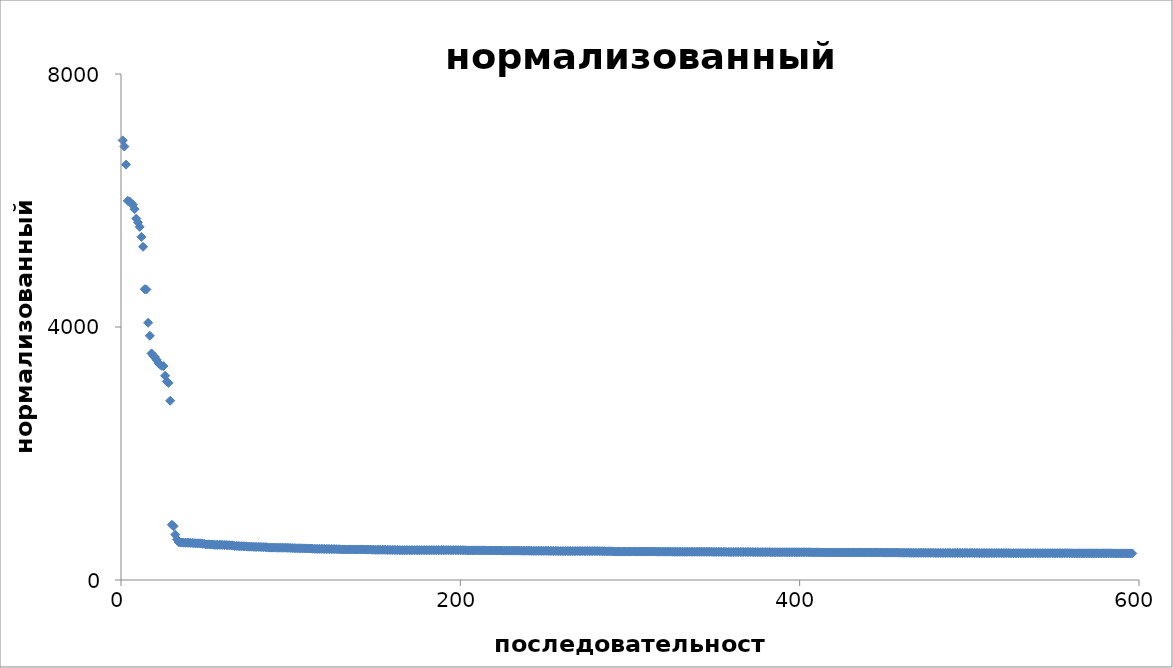
| Category | нормализованный вес |
|---|---|
| 1.0 | 6950.439 |
| 2.0 | 6853.223 |
| 3.0 | 6567.08 |
| 4.0 | 5994.792 |
| 5.0 | 5985.621 |
| 6.0 | 5954.438 |
| 7.0 | 5934.261 |
| 8.0 | 5862.726 |
| 9.0 | 5714.151 |
| 10.0 | 5653.62 |
| 11.0 | 5583.918 |
| 12.0 | 5424.338 |
| 13.0 | 5268.427 |
| 14.0 | 4597.089 |
| 15.0 | 4593.421 |
| 16.0 | 4066.99 |
| 17.0 | 3861.553 |
| 18.0 | 3582.746 |
| 19.0 | 3542.392 |
| 20.0 | 3525.884 |
| 21.0 | 3481.862 |
| 22.0 | 3430.503 |
| 23.0 | 3404.823 |
| 24.0 | 3386.481 |
| 25.0 | 3380.978 |
| 26.0 | 3228.735 |
| 27.0 | 3138.856 |
| 28.0 | 3116.845 |
| 29.0 | 2834.37 |
| 30.0 | 873.551 |
| 31.0 | 849.706 |
| 32.0 | 717.639 |
| 33.0 | 642.435 |
| 34.0 | 598.413 |
| 35.0 | 592.91 |
| 36.0 | 592.91 |
| 37.0 | 589.241 |
| 38.0 | 589.241 |
| 39.0 | 589.241 |
| 40.0 | 589.241 |
| 41.0 | 585.573 |
| 42.0 | 585.573 |
| 43.0 | 581.904 |
| 44.0 | 580.07 |
| 45.0 | 580.07 |
| 46.0 | 580.07 |
| 47.0 | 580.07 |
| 48.0 | 572.733 |
| 49.0 | 572.733 |
| 50.0 | 563.562 |
| 51.0 | 563.562 |
| 52.0 | 563.562 |
| 53.0 | 561.727 |
| 54.0 | 559.893 |
| 55.0 | 556.225 |
| 56.0 | 556.225 |
| 57.0 | 556.225 |
| 58.0 | 556.225 |
| 59.0 | 556.225 |
| 60.0 | 554.39 |
| 61.0 | 552.556 |
| 62.0 | 552.556 |
| 63.0 | 550.722 |
| 64.0 | 548.888 |
| 65.0 | 547.053 |
| 66.0 | 547.053 |
| 67.0 | 537.882 |
| 68.0 | 537.882 |
| 69.0 | 537.882 |
| 70.0 | 534.214 |
| 71.0 | 534.214 |
| 72.0 | 534.214 |
| 73.0 | 532.379 |
| 74.0 | 532.379 |
| 75.0 | 526.877 |
| 76.0 | 526.877 |
| 77.0 | 526.877 |
| 78.0 | 525.042 |
| 79.0 | 523.208 |
| 80.0 | 523.208 |
| 81.0 | 523.208 |
| 82.0 | 523.208 |
| 83.0 | 519.54 |
| 84.0 | 519.54 |
| 85.0 | 519.54 |
| 86.0 | 517.705 |
| 87.0 | 512.203 |
| 88.0 | 512.203 |
| 89.0 | 512.203 |
| 90.0 | 512.203 |
| 91.0 | 512.203 |
| 92.0 | 510.368 |
| 93.0 | 510.368 |
| 94.0 | 510.368 |
| 95.0 | 510.368 |
| 96.0 | 510.368 |
| 97.0 | 510.368 |
| 98.0 | 508.534 |
| 99.0 | 508.534 |
| 100.0 | 506.7 |
| 101.0 | 504.866 |
| 102.0 | 503.031 |
| 103.0 | 503.031 |
| 104.0 | 501.197 |
| 105.0 | 501.197 |
| 106.0 | 501.197 |
| 107.0 | 501.197 |
| 108.0 | 499.363 |
| 109.0 | 499.363 |
| 110.0 | 499.363 |
| 111.0 | 497.529 |
| 112.0 | 497.529 |
| 113.0 | 493.86 |
| 114.0 | 493.86 |
| 115.0 | 492.026 |
| 116.0 | 492.026 |
| 117.0 | 492.026 |
| 118.0 | 492.026 |
| 119.0 | 492.026 |
| 120.0 | 490.191 |
| 121.0 | 490.191 |
| 122.0 | 490.191 |
| 123.0 | 488.357 |
| 124.0 | 488.357 |
| 125.0 | 488.357 |
| 126.0 | 488.357 |
| 127.0 | 486.523 |
| 128.0 | 486.523 |
| 129.0 | 484.689 |
| 130.0 | 482.854 |
| 131.0 | 482.854 |
| 132.0 | 482.854 |
| 133.0 | 482.854 |
| 134.0 | 482.854 |
| 135.0 | 482.854 |
| 136.0 | 482.854 |
| 137.0 | 482.854 |
| 138.0 | 482.854 |
| 139.0 | 482.854 |
| 140.0 | 482.854 |
| 141.0 | 482.854 |
| 142.0 | 482.854 |
| 143.0 | 482.854 |
| 144.0 | 481.02 |
| 145.0 | 481.02 |
| 146.0 | 481.02 |
| 147.0 | 481.02 |
| 148.0 | 479.186 |
| 149.0 | 479.186 |
| 150.0 | 477.352 |
| 151.0 | 477.352 |
| 152.0 | 477.352 |
| 153.0 | 477.352 |
| 154.0 | 477.352 |
| 155.0 | 477.352 |
| 156.0 | 477.352 |
| 157.0 | 475.517 |
| 158.0 | 475.517 |
| 159.0 | 475.517 |
| 160.0 | 475.517 |
| 161.0 | 475.517 |
| 162.0 | 473.683 |
| 163.0 | 473.683 |
| 164.0 | 471.849 |
| 165.0 | 471.849 |
| 166.0 | 471.849 |
| 167.0 | 471.849 |
| 168.0 | 471.849 |
| 169.0 | 471.849 |
| 170.0 | 471.849 |
| 171.0 | 471.849 |
| 172.0 | 471.849 |
| 173.0 | 471.849 |
| 174.0 | 471.849 |
| 175.0 | 471.849 |
| 176.0 | 471.849 |
| 177.0 | 471.849 |
| 178.0 | 471.849 |
| 179.0 | 471.849 |
| 180.0 | 471.849 |
| 181.0 | 471.849 |
| 182.0 | 471.849 |
| 183.0 | 471.849 |
| 184.0 | 471.849 |
| 185.0 | 471.849 |
| 186.0 | 471.849 |
| 187.0 | 471.849 |
| 188.0 | 471.849 |
| 189.0 | 471.849 |
| 190.0 | 471.849 |
| 191.0 | 471.849 |
| 192.0 | 471.849 |
| 193.0 | 471.849 |
| 194.0 | 471.849 |
| 195.0 | 471.849 |
| 196.0 | 471.849 |
| 197.0 | 471.849 |
| 198.0 | 471.849 |
| 199.0 | 471.849 |
| 200.0 | 471.849 |
| 201.0 | 471.849 |
| 202.0 | 470.015 |
| 203.0 | 470.015 |
| 204.0 | 468.18 |
| 205.0 | 468.18 |
| 206.0 | 468.18 |
| 207.0 | 468.18 |
| 208.0 | 468.18 |
| 209.0 | 468.18 |
| 210.0 | 468.18 |
| 211.0 | 468.18 |
| 212.0 | 468.18 |
| 213.0 | 468.18 |
| 214.0 | 468.18 |
| 215.0 | 468.18 |
| 216.0 | 466.346 |
| 217.0 | 466.346 |
| 218.0 | 466.346 |
| 219.0 | 466.346 |
| 220.0 | 466.346 |
| 221.0 | 466.346 |
| 222.0 | 466.346 |
| 223.0 | 466.346 |
| 224.0 | 466.346 |
| 225.0 | 464.512 |
| 226.0 | 464.512 |
| 227.0 | 464.512 |
| 228.0 | 464.512 |
| 229.0 | 464.512 |
| 230.0 | 464.512 |
| 231.0 | 464.512 |
| 232.0 | 464.512 |
| 233.0 | 464.512 |
| 234.0 | 464.512 |
| 235.0 | 464.512 |
| 236.0 | 462.678 |
| 237.0 | 462.678 |
| 238.0 | 462.678 |
| 239.0 | 462.678 |
| 240.0 | 462.678 |
| 241.0 | 462.678 |
| 242.0 | 460.843 |
| 243.0 | 460.843 |
| 244.0 | 460.843 |
| 245.0 | 460.843 |
| 246.0 | 460.843 |
| 247.0 | 460.843 |
| 248.0 | 460.843 |
| 249.0 | 460.843 |
| 250.0 | 460.843 |
| 251.0 | 460.843 |
| 252.0 | 460.843 |
| 253.0 | 459.009 |
| 254.0 | 459.009 |
| 255.0 | 459.009 |
| 256.0 | 459.009 |
| 257.0 | 459.009 |
| 258.0 | 457.175 |
| 259.0 | 457.175 |
| 260.0 | 457.175 |
| 261.0 | 457.175 |
| 262.0 | 457.175 |
| 263.0 | 457.175 |
| 264.0 | 457.175 |
| 265.0 | 457.175 |
| 266.0 | 457.175 |
| 267.0 | 457.175 |
| 268.0 | 457.175 |
| 269.0 | 457.175 |
| 270.0 | 457.175 |
| 271.0 | 457.175 |
| 272.0 | 457.175 |
| 273.0 | 457.175 |
| 274.0 | 457.175 |
| 275.0 | 457.175 |
| 276.0 | 457.175 |
| 277.0 | 457.175 |
| 278.0 | 457.175 |
| 279.0 | 457.175 |
| 280.0 | 457.175 |
| 281.0 | 457.175 |
| 282.0 | 455.341 |
| 283.0 | 455.341 |
| 284.0 | 455.341 |
| 285.0 | 455.341 |
| 286.0 | 453.506 |
| 287.0 | 453.506 |
| 288.0 | 453.506 |
| 289.0 | 453.506 |
| 290.0 | 451.672 |
| 291.0 | 449.838 |
| 292.0 | 449.838 |
| 293.0 | 449.838 |
| 294.0 | 449.838 |
| 295.0 | 449.838 |
| 296.0 | 449.838 |
| 297.0 | 449.838 |
| 298.0 | 449.838 |
| 299.0 | 449.838 |
| 300.0 | 449.838 |
| 301.0 | 449.838 |
| 302.0 | 449.838 |
| 303.0 | 449.838 |
| 304.0 | 449.838 |
| 305.0 | 449.838 |
| 306.0 | 449.838 |
| 307.0 | 449.838 |
| 308.0 | 449.838 |
| 309.0 | 449.838 |
| 310.0 | 449.838 |
| 311.0 | 449.838 |
| 312.0 | 449.838 |
| 313.0 | 449.838 |
| 314.0 | 449.838 |
| 315.0 | 449.838 |
| 316.0 | 448.004 |
| 317.0 | 448.004 |
| 318.0 | 448.004 |
| 319.0 | 448.004 |
| 320.0 | 448.004 |
| 321.0 | 448.004 |
| 322.0 | 448.004 |
| 323.0 | 448.004 |
| 324.0 | 448.004 |
| 325.0 | 446.169 |
| 326.0 | 446.169 |
| 327.0 | 446.169 |
| 328.0 | 446.169 |
| 329.0 | 446.169 |
| 330.0 | 446.169 |
| 331.0 | 446.169 |
| 332.0 | 446.169 |
| 333.0 | 446.169 |
| 334.0 | 446.169 |
| 335.0 | 446.169 |
| 336.0 | 446.169 |
| 337.0 | 446.169 |
| 338.0 | 446.169 |
| 339.0 | 446.169 |
| 340.0 | 446.169 |
| 341.0 | 446.169 |
| 342.0 | 446.169 |
| 343.0 | 446.169 |
| 344.0 | 446.169 |
| 345.0 | 446.169 |
| 346.0 | 446.169 |
| 347.0 | 446.169 |
| 348.0 | 446.169 |
| 349.0 | 444.335 |
| 350.0 | 444.335 |
| 351.0 | 444.335 |
| 352.0 | 444.335 |
| 353.0 | 444.335 |
| 354.0 | 444.335 |
| 355.0 | 444.335 |
| 356.0 | 444.335 |
| 357.0 | 442.501 |
| 358.0 | 442.501 |
| 359.0 | 442.501 |
| 360.0 | 442.501 |
| 361.0 | 442.501 |
| 362.0 | 442.501 |
| 363.0 | 442.501 |
| 364.0 | 442.501 |
| 365.0 | 442.501 |
| 366.0 | 442.501 |
| 367.0 | 442.501 |
| 368.0 | 442.501 |
| 369.0 | 442.501 |
| 370.0 | 442.501 |
| 371.0 | 442.501 |
| 372.0 | 442.501 |
| 373.0 | 440.667 |
| 374.0 | 440.667 |
| 375.0 | 440.667 |
| 376.0 | 440.667 |
| 377.0 | 440.667 |
| 378.0 | 440.667 |
| 379.0 | 440.667 |
| 380.0 | 440.667 |
| 381.0 | 440.667 |
| 382.0 | 440.667 |
| 383.0 | 438.832 |
| 384.0 | 438.832 |
| 385.0 | 438.832 |
| 386.0 | 438.832 |
| 387.0 | 438.832 |
| 388.0 | 438.832 |
| 389.0 | 438.832 |
| 390.0 | 438.832 |
| 391.0 | 438.832 |
| 392.0 | 438.832 |
| 393.0 | 438.832 |
| 394.0 | 438.832 |
| 395.0 | 438.832 |
| 396.0 | 438.832 |
| 397.0 | 438.832 |
| 398.0 | 438.832 |
| 399.0 | 438.832 |
| 400.0 | 438.832 |
| 401.0 | 438.832 |
| 402.0 | 438.832 |
| 403.0 | 438.832 |
| 404.0 | 438.832 |
| 405.0 | 438.832 |
| 406.0 | 438.832 |
| 407.0 | 436.998 |
| 408.0 | 436.998 |
| 409.0 | 436.998 |
| 410.0 | 436.998 |
| 411.0 | 436.998 |
| 412.0 | 436.998 |
| 413.0 | 435.164 |
| 414.0 | 435.164 |
| 415.0 | 435.164 |
| 416.0 | 435.164 |
| 417.0 | 435.164 |
| 418.0 | 435.164 |
| 419.0 | 435.164 |
| 420.0 | 435.164 |
| 421.0 | 435.164 |
| 422.0 | 435.164 |
| 423.0 | 435.164 |
| 424.0 | 435.164 |
| 425.0 | 435.164 |
| 426.0 | 435.164 |
| 427.0 | 435.164 |
| 428.0 | 435.164 |
| 429.0 | 435.164 |
| 430.0 | 435.164 |
| 431.0 | 435.164 |
| 432.0 | 435.164 |
| 433.0 | 435.164 |
| 434.0 | 435.164 |
| 435.0 | 435.164 |
| 436.0 | 435.164 |
| 437.0 | 435.164 |
| 438.0 | 435.164 |
| 439.0 | 435.164 |
| 440.0 | 435.164 |
| 441.0 | 435.164 |
| 442.0 | 435.164 |
| 443.0 | 435.164 |
| 444.0 | 435.164 |
| 445.0 | 435.164 |
| 446.0 | 435.164 |
| 447.0 | 435.164 |
| 448.0 | 435.164 |
| 449.0 | 433.33 |
| 450.0 | 433.33 |
| 451.0 | 433.33 |
| 452.0 | 433.33 |
| 453.0 | 433.33 |
| 454.0 | 433.33 |
| 455.0 | 433.33 |
| 456.0 | 433.33 |
| 457.0 | 433.33 |
| 458.0 | 433.33 |
| 459.0 | 431.495 |
| 460.0 | 431.495 |
| 461.0 | 431.495 |
| 462.0 | 431.495 |
| 463.0 | 431.495 |
| 464.0 | 431.495 |
| 465.0 | 429.661 |
| 466.0 | 429.661 |
| 467.0 | 429.661 |
| 468.0 | 429.661 |
| 469.0 | 429.661 |
| 470.0 | 429.661 |
| 471.0 | 429.661 |
| 472.0 | 429.661 |
| 473.0 | 429.661 |
| 474.0 | 429.661 |
| 475.0 | 429.661 |
| 476.0 | 429.661 |
| 477.0 | 429.661 |
| 478.0 | 429.661 |
| 479.0 | 429.661 |
| 480.0 | 427.827 |
| 481.0 | 427.827 |
| 482.0 | 427.827 |
| 483.0 | 427.827 |
| 484.0 | 427.827 |
| 485.0 | 427.827 |
| 486.0 | 427.827 |
| 487.0 | 427.827 |
| 488.0 | 427.827 |
| 489.0 | 427.827 |
| 490.0 | 427.827 |
| 491.0 | 427.827 |
| 492.0 | 427.827 |
| 493.0 | 427.827 |
| 494.0 | 427.827 |
| 495.0 | 427.827 |
| 496.0 | 427.827 |
| 497.0 | 427.827 |
| 498.0 | 427.827 |
| 499.0 | 427.827 |
| 500.0 | 427.827 |
| 501.0 | 427.827 |
| 502.0 | 427.827 |
| 503.0 | 427.827 |
| 504.0 | 427.827 |
| 505.0 | 427.827 |
| 506.0 | 425.993 |
| 507.0 | 425.993 |
| 508.0 | 425.993 |
| 509.0 | 425.993 |
| 510.0 | 425.993 |
| 511.0 | 425.993 |
| 512.0 | 425.993 |
| 513.0 | 425.993 |
| 514.0 | 425.993 |
| 515.0 | 425.993 |
| 516.0 | 425.993 |
| 517.0 | 425.993 |
| 518.0 | 425.993 |
| 519.0 | 425.993 |
| 520.0 | 425.993 |
| 521.0 | 425.993 |
| 522.0 | 425.993 |
| 523.0 | 425.993 |
| 524.0 | 424.158 |
| 525.0 | 424.158 |
| 526.0 | 424.158 |
| 527.0 | 424.158 |
| 528.0 | 424.158 |
| 529.0 | 424.158 |
| 530.0 | 424.158 |
| 531.0 | 424.158 |
| 532.0 | 424.158 |
| 533.0 | 424.158 |
| 534.0 | 424.158 |
| 535.0 | 424.158 |
| 536.0 | 424.158 |
| 537.0 | 424.158 |
| 538.0 | 424.158 |
| 539.0 | 424.158 |
| 540.0 | 424.158 |
| 541.0 | 424.158 |
| 542.0 | 424.158 |
| 543.0 | 424.158 |
| 544.0 | 424.158 |
| 545.0 | 424.158 |
| 546.0 | 424.158 |
| 547.0 | 424.158 |
| 548.0 | 424.158 |
| 549.0 | 424.158 |
| 550.0 | 424.158 |
| 551.0 | 424.158 |
| 552.0 | 424.158 |
| 553.0 | 424.158 |
| 554.0 | 424.158 |
| 555.0 | 424.158 |
| 556.0 | 424.158 |
| 557.0 | 424.158 |
| 558.0 | 424.158 |
| 559.0 | 424.158 |
| 560.0 | 424.158 |
| 561.0 | 422.324 |
| 562.0 | 422.324 |
| 563.0 | 422.324 |
| 564.0 | 422.324 |
| 565.0 | 422.324 |
| 566.0 | 422.324 |
| 567.0 | 422.324 |
| 568.0 | 422.324 |
| 569.0 | 422.324 |
| 570.0 | 422.324 |
| 571.0 | 422.324 |
| 572.0 | 422.324 |
| 573.0 | 422.324 |
| 574.0 | 422.324 |
| 575.0 | 422.324 |
| 576.0 | 422.324 |
| 577.0 | 422.324 |
| 578.0 | 422.324 |
| 579.0 | 422.324 |
| 580.0 | 422.324 |
| 581.0 | 422.324 |
| 582.0 | 422.324 |
| 583.0 | 422.324 |
| 584.0 | 422.324 |
| 585.0 | 420.49 |
| 586.0 | 420.49 |
| 587.0 | 420.49 |
| 588.0 | 420.49 |
| 589.0 | 420.49 |
| 590.0 | 420.49 |
| 591.0 | 420.49 |
| 592.0 | 420.49 |
| 593.0 | 420.49 |
| 594.0 | 420.49 |
| 595.0 | 420.49 |
| 596.0 | 420.49 |